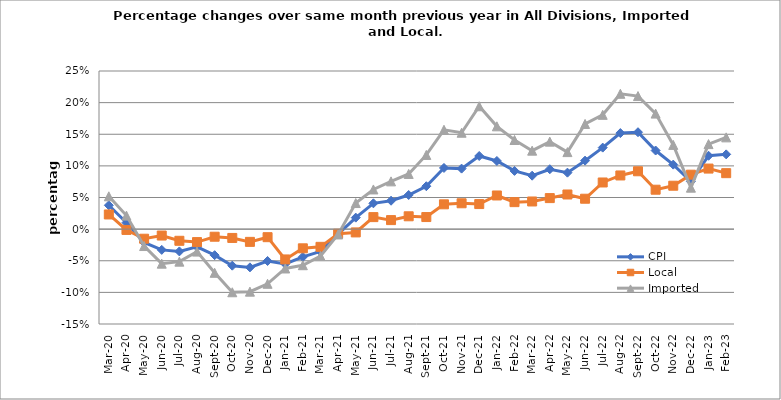
| Category | CPI | Local | Imported |
|---|---|---|---|
| 2020-03-01 | 0.038 | 0.023 | 0.052 |
| 2020-04-01 | 0.01 | -0.001 | 0.021 |
| 2020-05-01 | -0.021 | -0.015 | -0.027 |
| 2020-06-01 | -0.033 | -0.01 | -0.055 |
| 2020-07-01 | -0.035 | -0.018 | -0.051 |
| 2020-08-01 | -0.028 | -0.02 | -0.036 |
| 2020-09-01 | -0.041 | -0.012 | -0.069 |
| 2020-10-01 | -0.058 | -0.014 | -0.1 |
| 2020-11-01 | -0.06 | -0.02 | -0.099 |
| 2020-12-01 | -0.05 | -0.013 | -0.086 |
| 2021-01-01 | -0.055 | -0.048 | -0.062 |
| 2021-02-01 | -0.044 | -0.03 | -0.057 |
| 2021-03-01 | -0.035 | -0.028 | -0.043 |
| 2021-04-01 | -0.008 | -0.007 | -0.008 |
| 2021-05-01 | 0.018 | -0.005 | 0.041 |
| 2021-06-01 | 0.041 | 0.019 | 0.063 |
| 2021-07-01 | 0.045 | 0.014 | 0.075 |
| 2021-08-01 | 0.054 | 0.02 | 0.087 |
| 2021-09-01 | 0.068 | 0.019 | 0.117 |
| 2021-10-01 | 0.097 | 0.039 | 0.157 |
| 2021-11-01 | 0.096 | 0.041 | 0.152 |
| 2021-12-01 | 0.116 | 0.04 | 0.194 |
| 2022-01-01 | 0.108 | 0.053 | 0.163 |
| 2022-02-01 | 0.092 | 0.043 | 0.141 |
| 2022-03-01 | 0.085 | 0.044 | 0.124 |
| 2022-04-01 | 0.095 | 0.049 | 0.138 |
| 2022-05-01 | 0.089 | 0.055 | 0.122 |
| 2022-06-01 | 0.108 | 0.048 | 0.166 |
| 2022-07-01 | 0.129 | 0.074 | 0.181 |
| 2022-08-01 | 0.152 | 0.085 | 0.214 |
| 2022-09-01 | 0.153 | 0.091 | 0.21 |
| 2022-10-01 | 0.124 | 0.062 | 0.183 |
| 2022-11-01 | 0.102 | 0.069 | 0.133 |
| 2022-12-01 | 0.075 | 0.086 | 0.066 |
| 2023-01-01 | 0.116 | 0.096 | 0.134 |
| 2023-02-01 | 0.118 | 0.088 | 0.145 |